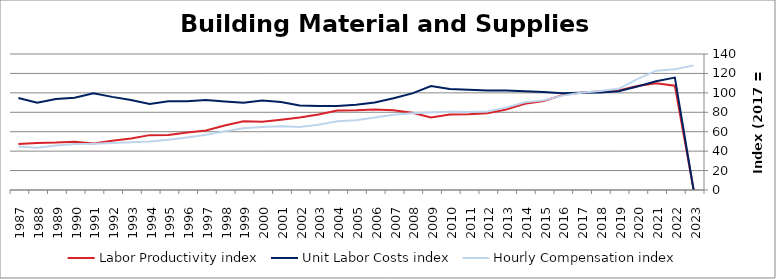
| Category | Labor Productivity index | Unit Labor Costs index | Hourly Compensation index |
|---|---|---|---|
| 2023.0 | 0 | 0 | 128.306 |
| 2022.0 | 107.353 | 115.704 | 124.212 |
| 2021.0 | 109.761 | 111.911 | 122.834 |
| 2020.0 | 107.141 | 106.552 | 114.161 |
| 2019.0 | 102.411 | 101.757 | 104.211 |
| 2018.0 | 101.582 | 100.369 | 101.956 |
| 2017.0 | 100 | 100 | 100 |
| 2016.0 | 97.671 | 99.484 | 97.167 |
| 2015.0 | 91.571 | 100.757 | 92.264 |
| 2014.0 | 88.848 | 101.764 | 90.416 |
| 2013.0 | 82.817 | 102.366 | 84.776 |
| 2012.0 | 78.923 | 102.38 | 80.801 |
| 2011.0 | 77.977 | 103.089 | 80.386 |
| 2010.0 | 77.602 | 103.936 | 80.657 |
| 2009.0 | 74.577 | 106.956 | 79.765 |
| 2008.0 | 79.503 | 99.473 | 79.084 |
| 2007.0 | 82.144 | 94.426 | 77.565 |
| 2006.0 | 82.887 | 89.994 | 74.593 |
| 2005.0 | 82.02 | 87.665 | 71.903 |
| 2004.0 | 81.829 | 86.484 | 70.769 |
| 2003.0 | 77.648 | 86.458 | 67.133 |
| 2002.0 | 74.597 | 86.917 | 64.838 |
| 2001.0 | 72.318 | 90.655 | 65.56 |
| 2000.0 | 70.188 | 92.241 | 64.743 |
| 1999.0 | 70.747 | 89.745 | 63.492 |
| 1998.0 | 66.421 | 91.14 | 60.536 |
| 1997.0 | 61.221 | 92.678 | 56.738 |
| 1996.0 | 59.194 | 91.487 | 54.155 |
| 1995.0 | 56.683 | 91.441 | 51.832 |
| 1994.0 | 56.483 | 88.559 | 50.021 |
| 1993.0 | 53.111 | 92.634 | 49.198 |
| 1992.0 | 50.593 | 95.858 | 48.498 |
| 1991.0 | 47.859 | 99.533 | 47.635 |
| 1990.0 | 49.752 | 94.935 | 47.232 |
| 1989.0 | 48.772 | 93.738 | 45.718 |
| 1988.0 | 48.505 | 89.752 | 43.534 |
| 1987.0 | 47.421 | 94.633 | 44.876 |